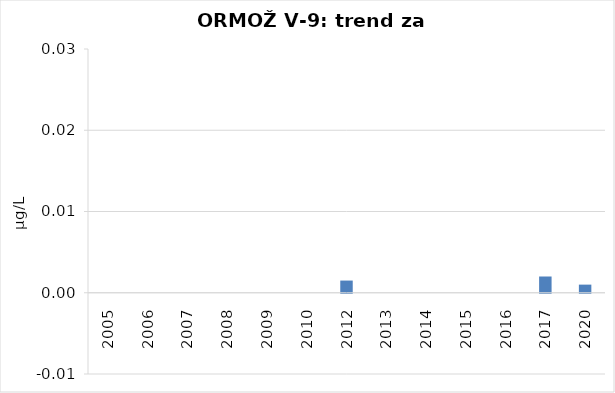
| Category | Vsota |
|---|---|
| 2005 | 0 |
| 2006 | 0 |
| 2007 | 0 |
| 2008 | 0 |
| 2009 | 0 |
| 2010 | 0 |
| 2012 | 0.002 |
| 2013 | 0 |
| 2014 | 0 |
| 2015 | 0 |
| 2016 | 0 |
| 2017 | 0.002 |
| 2020 | 0.001 |